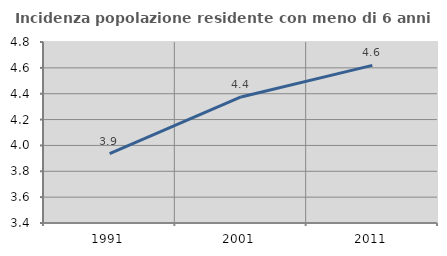
| Category | Incidenza popolazione residente con meno di 6 anni |
|---|---|
| 1991.0 | 3.936 |
| 2001.0 | 4.375 |
| 2011.0 | 4.619 |